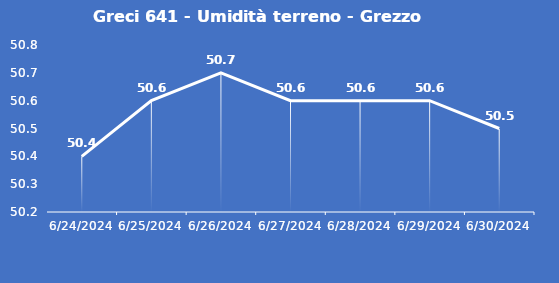
| Category | Greci 641 - Umidità terreno - Grezzo (%VWC) |
|---|---|
| 6/24/24 | 50.4 |
| 6/25/24 | 50.6 |
| 6/26/24 | 50.7 |
| 6/27/24 | 50.6 |
| 6/28/24 | 50.6 |
| 6/29/24 | 50.6 |
| 6/30/24 | 50.5 |